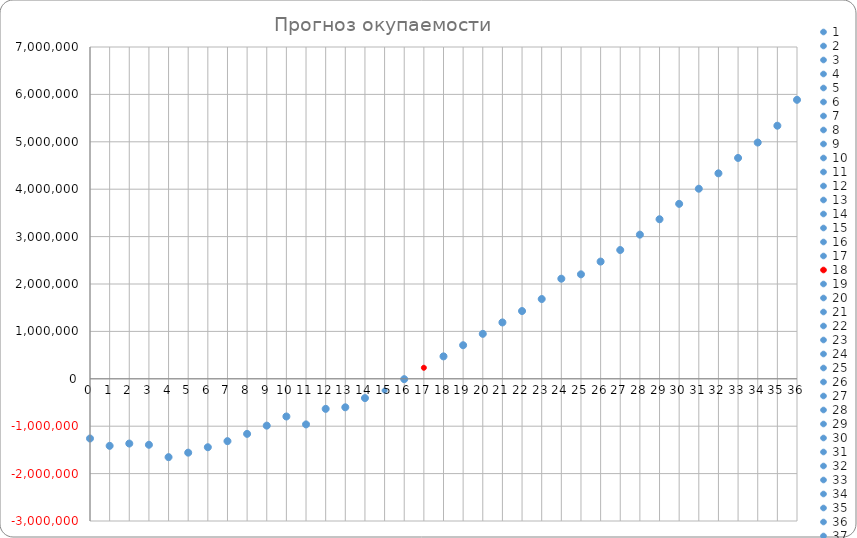
| Category | Автомобили в лизинге |
|---|---|
| 0.0 | -1259610 |
| 1.0 | -1414532.125 |
| 2.0 | -1366088.888 |
| 3.0 | -1391753.688 |
| 4.0 | -1652803.112 |
| 5.0 | -1558157.162 |
| 6.0 | -1443815.838 |
| 7.0 | -1315379.138 |
| 8.0 | -1161647.062 |
| 9.0 | -988219.612 |
| 10.0 | -795096.787 |
| 11.0 | -962417.087 |
| 12.0 | -634035.888 |
| 13.0 | -601039.638 |
| 14.0 | -407646.087 |
| 15.0 | -248118.887 |
| 16.0 | -7671.688 |
| 17.0 | 232775.512 |
| 18.0 | 473222.712 |
| 19.0 | 708069.912 |
| 20.0 | 948517.112 |
| 21.0 | 1188964.312 |
| 22.0 | 1429411.513 |
| 23.0 | 1683046.013 |
| 24.0 | 2111707.812 |
| 25.0 | 2203708.392 |
| 26.0 | 2472964.652 |
| 27.0 | 2716783.752 |
| 28.0 | 3041522.852 |
| 29.0 | 3366261.952 |
| 30.0 | 3691001.052 |
| 31.0 | 4010140.152 |
| 32.0 | 4334879.252 |
| 33.0 | 4659618.352 |
| 34.0 | 4984357.452 |
| 35.0 | 5339142.232 |
| 36.0 | 5885812.692 |